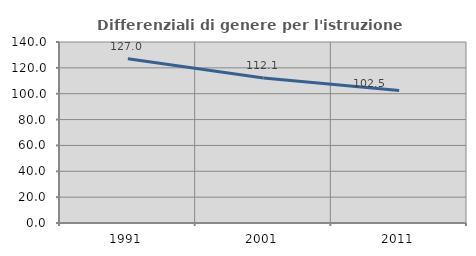
| Category | Differenziali di genere per l'istruzione superiore |
|---|---|
| 1991.0 | 126.99 |
| 2001.0 | 112.074 |
| 2011.0 | 102.518 |